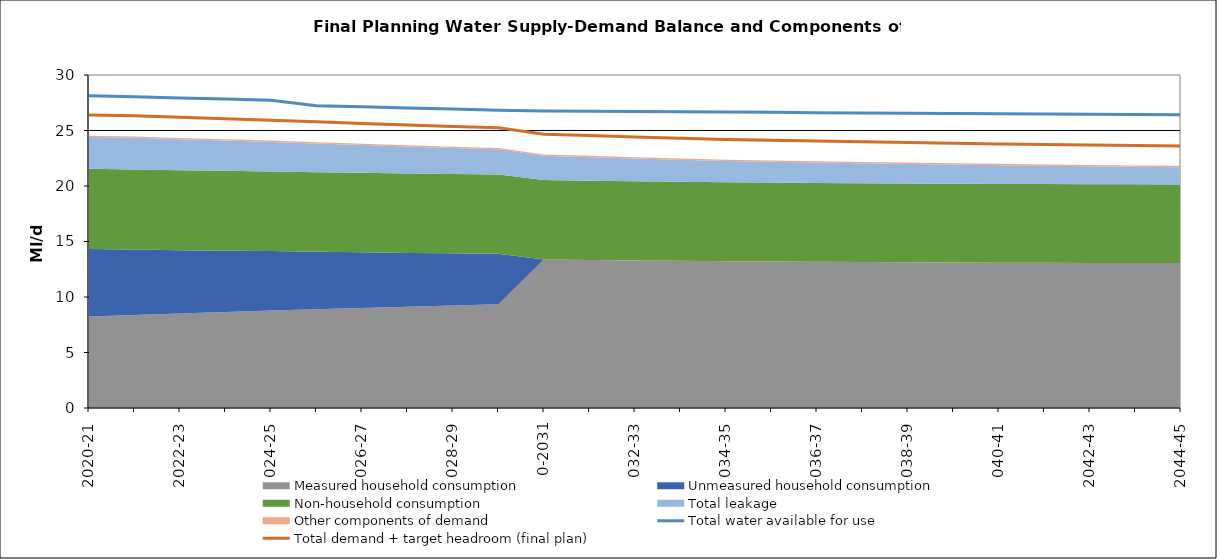
| Category | Total water available for use | Total demand + target headroom (final plan) |
|---|---|---|
| 0 | 28.135 | 26.391 |
| 1 | 28.035 | 26.32 |
| 2 | 27.935 | 26.185 |
| 3 | 27.835 | 26.055 |
| 4 | 27.735 | 25.933 |
| 5 | 27.235 | 25.782 |
| 6 | 27.135 | 25.639 |
| 7 | 27.035 | 25.503 |
| 8 | 26.935 | 25.371 |
| 9 | 26.835 | 25.246 |
| 10 | 26.76 | 24.662 |
| 11 | 26.735 | 24.539 |
| 12 | 26.71 | 24.42 |
| 13 | 26.685 | 24.302 |
| 14 | 26.66 | 24.189 |
| 15 | 26.635 | 24.115 |
| 16 | 26.61 | 24.044 |
| 17 | 26.585 | 23.976 |
| 18 | 26.56 | 23.91 |
| 19 | 26.535 | 23.847 |
| 20 | 26.51 | 23.789 |
| 21 | 26.485 | 23.738 |
| 22 | 26.46 | 23.691 |
| 23 | 26.435 | 23.642 |
| 24 | 26.41 | 23.595 |